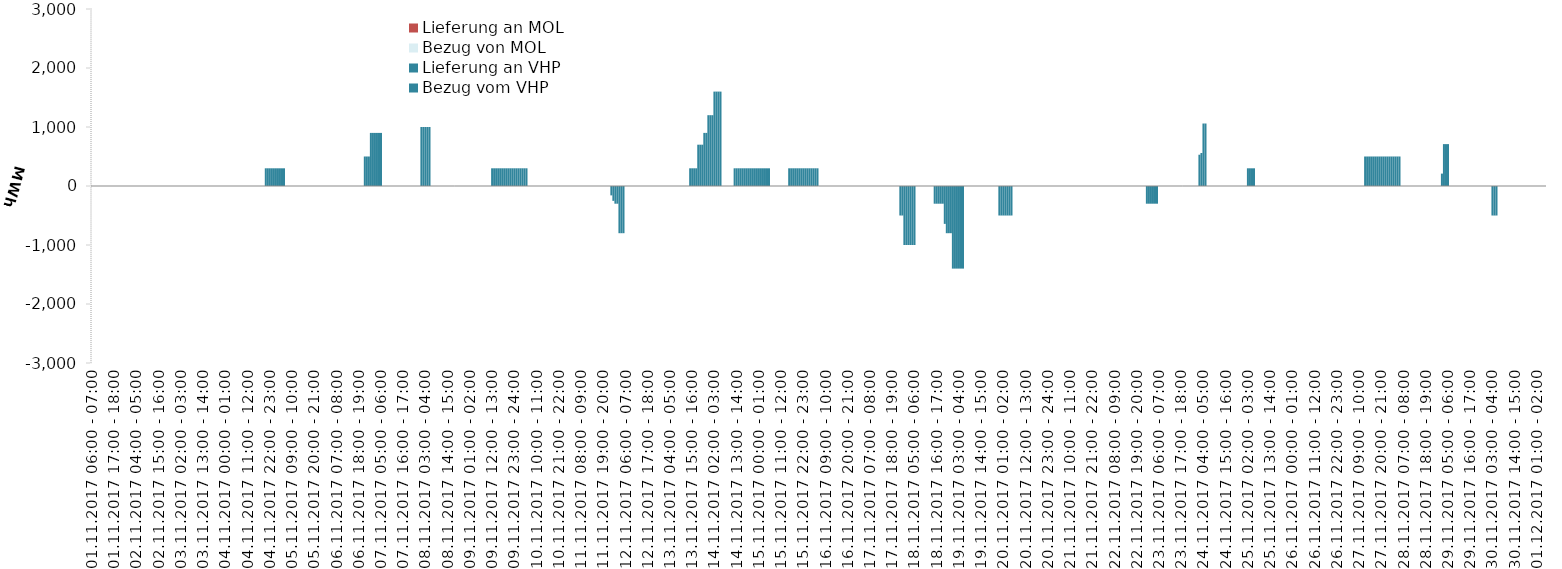
| Category | Bezug vom VHP | Lieferung an VHP | Bezug von MOL | Lieferung an MOL |
|---|---|---|---|---|
| 01.11.2017 06:00 - 07:00 | 0 | 0 | 0 | 0 |
| 01.11.2017 07:00 - 08:00 | 0 | 0 | 0 | 0 |
| 01.11.2017 08:00 - 09:00 | 0 | 0 | 0 | 0 |
| 01.11.2017 09:00 - 10:00 | 0 | 0 | 0 | 0 |
| 01.11.2017 10:00 - 11:00 | 0 | 0 | 0 | 0 |
| 01.11.2017 11:00 - 12:00 | 0 | 0 | 0 | 0 |
| 01.11.2017 12:00 - 13:00 | 0 | 0 | 0 | 0 |
| 01.11.2017 13:00 - 14:00 | 0 | 0 | 0 | 0 |
| 01.11.2017 14:00 - 15:00 | 0 | 0 | 0 | 0 |
| 01.11.2017 15:00 - 16:00 | 0 | 0 | 0 | 0 |
| 01.11.2017 16:00 - 17:00 | 0 | 0 | 0 | 0 |
| 01.11.2017 17:00 - 18:00 | 0 | 0 | 0 | 0 |
| 01.11.2017 18:00 - 19:00 | 0 | 0 | 0 | 0 |
| 01.11.2017 19:00 - 20:00 | 0 | 0 | 0 | 0 |
| 01.11.2017 20:00 - 21:00 | 0 | 0 | 0 | 0 |
| 01.11.2017 21:00 - 22:00 | 0 | 0 | 0 | 0 |
| 01.11.2017 22:00 - 23:00 | 0 | 0 | 0 | 0 |
| 01.11.2017 23:00 - 24:00 | 0 | 0 | 0 | 0 |
| 02.11.2017 00:00 - 01:00 | 0 | 0 | 0 | 0 |
| 02.11.2017 01:00 - 02:00 | 0 | 0 | 0 | 0 |
| 02.11.2017 02:00 - 03:00 | 0 | 0 | 0 | 0 |
| 02.11.2017 03:00 - 04:00 | 0 | 0 | 0 | 0 |
| 02.11.2017 04:00 - 05:00 | 0 | 0 | 0 | 0 |
| 02.11.2017 05:00 - 06:00 | 0 | 0 | 0 | 0 |
| 02.11.2017 06:00 - 07:00 | 0 | 0 | 0 | 0 |
| 02.11.2017 07:00 - 08:00 | 0 | 0 | 0 | 0 |
| 02.11.2017 08:00 - 09:00 | 0 | 0 | 0 | 0 |
| 02.11.2017 09:00 - 10:00 | 0 | 0 | 0 | 0 |
| 02.11.2017 10:00 - 11:00 | 0 | 0 | 0 | 0 |
| 02.11.2017 11:00 - 12:00 | 0 | 0 | 0 | 0 |
| 02.11.2017 12:00 - 13:00 | 0 | 0 | 0 | 0 |
| 02.11.2017 13:00 - 14:00 | 0 | 0 | 0 | 0 |
| 02.11.2017 14:00 - 15:00 | 0 | 0 | 0 | 0 |
| 02.11.2017 15:00 - 16:00 | 0 | 0 | 0 | 0 |
| 02.11.2017 16:00 - 17:00 | 0 | 0 | 0 | 0 |
| 02.11.2017 17:00 - 18:00 | 0 | 0 | 0 | 0 |
| 02.11.2017 18:00 - 19:00 | 0 | 0 | 0 | 0 |
| 02.11.2017 19:00 - 20:00 | 0 | 0 | 0 | 0 |
| 02.11.2017 20:00 - 21:00 | 0 | 0 | 0 | 0 |
| 02.11.2017 21:00 - 22:00 | 0 | 0 | 0 | 0 |
| 02.11.2017 22:00 - 23:00 | 0 | 0 | 0 | 0 |
| 02.11.2017 23:00 - 24:00 | 0 | 0 | 0 | 0 |
| 03.11.2017 00:00 - 01:00 | 0 | 0 | 0 | 0 |
| 03.11.2017 01:00 - 02:00 | 0 | 0 | 0 | 0 |
| 03.11.2017 02:00 - 03:00 | 0 | 0 | 0 | 0 |
| 03.11.2017 03:00 - 04:00 | 0 | 0 | 0 | 0 |
| 03.11.2017 04:00 - 05:00 | 0 | 0 | 0 | 0 |
| 03.11.2017 05:00 - 06:00 | 0 | 0 | 0 | 0 |
| 03.11.2017 06:00 - 07:00 | 0 | 0 | 0 | 0 |
| 03.11.2017 07:00 - 08:00 | 0 | 0 | 0 | 0 |
| 03.11.2017 08:00 - 09:00 | 0 | 0 | 0 | 0 |
| 03.11.2017 09:00 - 10:00 | 0 | 0 | 0 | 0 |
| 03.11.2017 10:00 - 11:00 | 0 | 0 | 0 | 0 |
| 03.11.2017 11:00 - 12:00 | 0 | 0 | 0 | 0 |
| 03.11.2017 12:00 - 13:00 | 0 | 0 | 0 | 0 |
| 03.11.2017 13:00 - 14:00 | 0 | 0 | 0 | 0 |
| 03.11.2017 14:00 - 15:00 | 0 | 0 | 0 | 0 |
| 03.11.2017 15:00 - 16:00 | 0 | 0 | 0 | 0 |
| 03.11.2017 16:00 - 17:00 | 0 | 0 | 0 | 0 |
| 03.11.2017 17:00 - 18:00 | 0 | 0 | 0 | 0 |
| 03.11.2017 18:00 - 19:00 | 0 | 0 | 0 | 0 |
| 03.11.2017 19:00 - 20:00 | 0 | 0 | 0 | 0 |
| 03.11.2017 20:00 - 21:00 | 0 | 0 | 0 | 0 |
| 03.11.2017 21:00 - 22:00 | 0 | 0 | 0 | 0 |
| 03.11.2017 22:00 - 23:00 | 0 | 0 | 0 | 0 |
| 03.11.2017 23:00 - 24:00 | 0 | 0 | 0 | 0 |
| 04.11.2017 00:00 - 01:00 | 0 | 0 | 0 | 0 |
| 04.11.2017 01:00 - 02:00 | 0 | 0 | 0 | 0 |
| 04.11.2017 02:00 - 03:00 | 0 | 0 | 0 | 0 |
| 04.11.2017 03:00 - 04:00 | 0 | 0 | 0 | 0 |
| 04.11.2017 04:00 - 05:00 | 0 | 0 | 0 | 0 |
| 04.11.2017 05:00 - 06:00 | 0 | 0 | 0 | 0 |
| 04.11.2017 06:00 - 07:00 | 0 | 0 | 0 | 0 |
| 04.11.2017 07:00 - 08:00 | 0 | 0 | 0 | 0 |
| 04.11.2017 08:00 - 09:00 | 0 | 0 | 0 | 0 |
| 04.11.2017 09:00 - 10:00 | 0 | 0 | 0 | 0 |
| 04.11.2017 10:00 - 11:00 | 0 | 0 | 0 | 0 |
| 04.11.2017 11:00 - 12:00 | 0 | 0 | 0 | 0 |
| 04.11.2017 12:00 - 13:00 | 0 | 0 | 0 | 0 |
| 04.11.2017 13:00 - 14:00 | 0 | 0 | 0 | 0 |
| 04.11.2017 14:00 - 15:00 | 0 | 0 | 0 | 0 |
| 04.11.2017 15:00 - 16:00 | 0 | 0 | 0 | 0 |
| 04.11.2017 16:00 - 17:00 | 0 | 0 | 0 | 0 |
| 04.11.2017 17:00 - 18:00 | 0 | 0 | 0 | 0 |
| 04.11.2017 18:00 - 19:00 | 0 | 0 | 0 | 0 |
| 04.11.2017 19:00 - 20:00 | 0 | 0 | 0 | 0 |
| 04.11.2017 20:00 - 21:00 | 300 | 0 | 0 | 0 |
| 04.11.2017 21:00 - 22:00 | 300 | 0 | 0 | 0 |
| 04.11.2017 22:00 - 23:00 | 300 | 0 | 0 | 0 |
| 04.11.2017 23:00 - 24:00 | 300 | 0 | 0 | 0 |
| 05.11.2017 00:00 - 01:00 | 300 | 0 | 0 | 0 |
| 05.11.2017 01:00 - 02:00 | 300 | 0 | 0 | 0 |
| 05.11.2017 02:00 - 03:00 | 300 | 0 | 0 | 0 |
| 05.11.2017 03:00 - 04:00 | 300 | 0 | 0 | 0 |
| 05.11.2017 04:00 - 05:00 | 300 | 0 | 0 | 0 |
| 05.11.2017 05:00 - 06:00 | 300 | 0 | 0 | 0 |
| 05.11.2017 06:00 - 07:00 | 0 | 0 | 0 | 0 |
| 05.11.2017 07:00 - 08:00 | 0 | 0 | 0 | 0 |
| 05.11.2017 08:00 - 09:00 | 0 | 0 | 0 | 0 |
| 05.11.2017 09:00 - 10:00 | 0 | 0 | 0 | 0 |
| 05.11.2017 10:00 - 11:00 | 0 | 0 | 0 | 0 |
| 05.11.2017 11:00 - 12:00 | 0 | 0 | 0 | 0 |
| 05.11.2017 12:00 - 13:00 | 0 | 0 | 0 | 0 |
| 05.11.2017 13:00 - 14:00 | 0 | 0 | 0 | 0 |
| 05.11.2017 14:00 - 15:00 | 0 | 0 | 0 | 0 |
| 05.11.2017 15:00 - 16:00 | 0 | 0 | 0 | 0 |
| 05.11.2017 16:00 - 17:00 | 0 | 0 | 0 | 0 |
| 05.11.2017 17:00 - 18:00 | 0 | 0 | 0 | 0 |
| 05.11.2017 18:00 - 19:00 | 0 | 0 | 0 | 0 |
| 05.11.2017 19:00 - 20:00 | 0 | 0 | 0 | 0 |
| 05.11.2017 20:00 - 21:00 | 0 | 0 | 0 | 0 |
| 05.11.2017 21:00 - 22:00 | 0 | 0 | 0 | 0 |
| 05.11.2017 22:00 - 23:00 | 0 | 0 | 0 | 0 |
| 05.11.2017 23:00 - 24:00 | 0 | 0 | 0 | 0 |
| 06.11.2017 00:00 - 01:00 | 0 | 0 | 0 | 0 |
| 06.11.2017 01:00 - 02:00 | 0 | 0 | 0 | 0 |
| 06.11.2017 02:00 - 03:00 | 0 | 0 | 0 | 0 |
| 06.11.2017 03:00 - 04:00 | 0 | 0 | 0 | 0 |
| 06.11.2017 04:00 - 05:00 | 0 | 0 | 0 | 0 |
| 06.11.2017 05:00 - 06:00 | 0 | 0 | 0 | 0 |
| 06.11.2017 06:00 - 07:00 | 0 | 0 | 0 | 0 |
| 06.11.2017 07:00 - 08:00 | 0 | 0 | 0 | 0 |
| 06.11.2017 08:00 - 09:00 | 0 | 0 | 0 | 0 |
| 06.11.2017 09:00 - 10:00 | 0 | 0 | 0 | 0 |
| 06.11.2017 10:00 - 11:00 | 0 | 0 | 0 | 0 |
| 06.11.2017 11:00 - 12:00 | 0 | 0 | 0 | 0 |
| 06.11.2017 12:00 - 13:00 | 0 | 0 | 0 | 0 |
| 06.11.2017 13:00 - 14:00 | 0 | 0 | 0 | 0 |
| 06.11.2017 14:00 - 15:00 | 0 | 0 | 0 | 0 |
| 06.11.2017 15:00 - 16:00 | 0 | 0 | 0 | 0 |
| 06.11.2017 16:00 - 17:00 | 0 | 0 | 0 | 0 |
| 06.11.2017 17:00 - 18:00 | 0 | 0 | 0 | 0 |
| 06.11.2017 18:00 - 19:00 | 0 | 0 | 0 | 0 |
| 06.11.2017 19:00 - 20:00 | 0 | 0 | 0 | 0 |
| 06.11.2017 20:00 - 21:00 | 0 | 0 | 0 | 0 |
| 06.11.2017 21:00 - 22:00 | 500 | 0 | 0 | 0 |
| 06.11.2017 22:00 - 23:00 | 500 | 0 | 0 | 0 |
| 06.11.2017 23:00 - 24:00 | 500 | 0 | 0 | 0 |
| 07.11.2017 00:00 - 01:00 | 900 | 0 | 0 | 0 |
| 07.11.2017 01:00 - 02:00 | 900 | 0 | 0 | 0 |
| 07.11.2017 02:00 - 03:00 | 900 | 0 | 0 | 0 |
| 07.11.2017 03:00 - 04:00 | 900 | 0 | 0 | 0 |
| 07.11.2017 04:00 - 05:00 | 900 | 0 | 0 | 0 |
| 07.11.2017 05:00 - 06:00 | 900 | 0 | 0 | 0 |
| 07.11.2017 06:00 - 07:00 | 0 | 0 | 0 | 0 |
| 07.11.2017 07:00 - 08:00 | 0 | 0 | 0 | 0 |
| 07.11.2017 08:00 - 09:00 | 0 | 0 | 0 | 0 |
| 07.11.2017 09:00 - 10:00 | 0 | 0 | 0 | 0 |
| 07.11.2017 10:00 - 11:00 | 0 | 0 | 0 | 0 |
| 07.11.2017 11:00 - 12:00 | 0 | 0 | 0 | 0 |
| 07.11.2017 12:00 - 13:00 | 0 | 0 | 0 | 0 |
| 07.11.2017 13:00 - 14:00 | 0 | 0 | 0 | 0 |
| 07.11.2017 14:00 - 15:00 | 0 | 0 | 0 | 0 |
| 07.11.2017 15:00 - 16:00 | 0 | 0 | 0 | 0 |
| 07.11.2017 16:00 - 17:00 | 0 | 0 | 0 | 0 |
| 07.11.2017 17:00 - 18:00 | 0 | 0 | 0 | 0 |
| 07.11.2017 18:00 - 19:00 | 0 | 0 | 0 | 0 |
| 07.11.2017 19:00 - 20:00 | 0 | 0 | 0 | 0 |
| 07.11.2017 20:00 - 21:00 | 0 | 0 | 0 | 0 |
| 07.11.2017 21:00 - 22:00 | 0 | 0 | 0 | 0 |
| 07.11.2017 22:00 - 23:00 | 0 | 0 | 0 | 0 |
| 07.11.2017 23:00 - 24:00 | 0 | 0 | 0 | 0 |
| 08.11.2017 00:00 - 01:00 | 0 | 0 | 0 | 0 |
| 08.11.2017 01:00 - 02:00 | 1000 | 0 | 0 | 0 |
| 08.11.2017 02:00 - 03:00 | 1000 | 0 | 0 | 0 |
| 08.11.2017 03:00 - 04:00 | 1000 | 0 | 0 | 0 |
| 08.11.2017 04:00 - 05:00 | 1000 | 0 | 0 | 0 |
| 08.11.2017 05:00 - 06:00 | 1000 | 0 | 0 | 0 |
| 08.11.2017 06:00 - 07:00 | 0 | 0 | 0 | 0 |
| 08.11.2017 07:00 - 08:00 | 0 | 0 | 0 | 0 |
| 08.11.2017 08:00 - 09:00 | 0 | 0 | 0 | 0 |
| 08.11.2017 09:00 - 10:00 | 0 | 0 | 0 | 0 |
| 08.11.2017 10:00 - 11:00 | 0 | 0 | 0 | 0 |
| 08.11.2017 11:00 - 12:00 | 0 | 0 | 0 | 0 |
| 08.11.2017 12:00 - 13:00 | 0 | 0 | 0 | 0 |
| 08.11.2017 13:00 - 14:00 | 0 | 0 | 0 | 0 |
| 08.11.2017 14:00 - 15:00 | 0 | 0 | 0 | 0 |
| 08.11.2017 15:00 - 16:00 | 0 | 0 | 0 | 0 |
| 08.11.2017 16:00 - 17:00 | 0 | 0 | 0 | 0 |
| 08.11.2017 17:00 - 18:00 | 0 | 0 | 0 | 0 |
| 08.11.2017 18:00 - 19:00 | 0 | 0 | 0 | 0 |
| 08.11.2017 19:00 - 20:00 | 0 | 0 | 0 | 0 |
| 08.11.2017 20:00 - 21:00 | 0 | 0 | 0 | 0 |
| 08.11.2017 21:00 - 22:00 | 0 | 0 | 0 | 0 |
| 08.11.2017 22:00 - 23:00 | 0 | 0 | 0 | 0 |
| 08.11.2017 23:00 - 24:00 | 0 | 0 | 0 | 0 |
| 09.11.2017 00:00 - 01:00 | 0 | 0 | 0 | 0 |
| 09.11.2017 01:00 - 02:00 | 0 | 0 | 0 | 0 |
| 09.11.2017 02:00 - 03:00 | 0 | 0 | 0 | 0 |
| 09.11.2017 03:00 - 04:00 | 0 | 0 | 0 | 0 |
| 09.11.2017 04:00 - 05:00 | 0 | 0 | 0 | 0 |
| 09.11.2017 05:00 - 06:00 | 0 | 0 | 0 | 0 |
| 09.11.2017 06:00 - 07:00 | 0 | 0 | 0 | 0 |
| 09.11.2017 07:00 - 08:00 | 0 | 0 | 0 | 0 |
| 09.11.2017 08:00 - 09:00 | 0 | 0 | 0 | 0 |
| 09.11.2017 09:00 - 10:00 | 0 | 0 | 0 | 0 |
| 09.11.2017 10:00 - 11:00 | 0 | 0 | 0 | 0 |
| 09.11.2017 11:00 - 12:00 | 0 | 0 | 0 | 0 |
| 09.11.2017 12:00 - 13:00 | 300 | 0 | 0 | 0 |
| 09.11.2017 13:00 - 14:00 | 300 | 0 | 0 | 0 |
| 09.11.2017 14:00 - 15:00 | 300 | 0 | 0 | 0 |
| 09.11.2017 15:00 - 16:00 | 300 | 0 | 0 | 0 |
| 09.11.2017 16:00 - 17:00 | 300 | 0 | 0 | 0 |
| 09.11.2017 17:00 - 18:00 | 300 | 0 | 0 | 0 |
| 09.11.2017 18:00 - 19:00 | 300 | 0 | 0 | 0 |
| 09.11.2017 19:00 - 20:00 | 300 | 0 | 0 | 0 |
| 09.11.2017 20:00 - 21:00 | 300 | 0 | 0 | 0 |
| 09.11.2017 21:00 - 22:00 | 300 | 0 | 0 | 0 |
| 09.11.2017 22:00 - 23:00 | 300 | 0 | 0 | 0 |
| 09.11.2017 23:00 - 24:00 | 300 | 0 | 0 | 0 |
| 10.11.2017 00:00 - 01:00 | 300 | 0 | 0 | 0 |
| 10.11.2017 01:00 - 02:00 | 300 | 0 | 0 | 0 |
| 10.11.2017 02:00 - 03:00 | 300 | 0 | 0 | 0 |
| 10.11.2017 03:00 - 04:00 | 300 | 0 | 0 | 0 |
| 10.11.2017 04:00 - 05:00 | 300 | 0 | 0 | 0 |
| 10.11.2017 05:00 - 06:00 | 300 | 0 | 0 | 0 |
| 10.11.2017 06:00 - 07:00 | 0 | 0 | 0 | 0 |
| 10.11.2017 07:00 - 08:00 | 0 | 0 | 0 | 0 |
| 10.11.2017 08:00 - 09:00 | 0 | 0 | 0 | 0 |
| 10.11.2017 09:00 - 10:00 | 0 | 0 | 0 | 0 |
| 10.11.2017 10:00 - 11:00 | 0 | 0 | 0 | 0 |
| 10.11.2017 11:00 - 12:00 | 0 | 0 | 0 | 0 |
| 10.11.2017 12:00 - 13:00 | 0 | 0 | 0 | 0 |
| 10.11.2017 13:00 - 14:00 | 0 | 0 | 0 | 0 |
| 10.11.2017 14:00 - 15:00 | 0 | 0 | 0 | 0 |
| 10.11.2017 15:00 - 16:00 | 0 | 0 | 0 | 0 |
| 10.11.2017 16:00 - 17:00 | 0 | 0 | 0 | 0 |
| 10.11.2017 17:00 - 18:00 | 0 | 0 | 0 | 0 |
| 10.11.2017 18:00 - 19:00 | 0 | 0 | 0 | 0 |
| 10.11.2017 19:00 - 20:00 | 0 | 0 | 0 | 0 |
| 10.11.2017 20:00 - 21:00 | 0 | 0 | 0 | 0 |
| 10.11.2017 21:00 - 22:00 | 0 | 0 | 0 | 0 |
| 10.11.2017 22:00 - 23:00 | 0 | 0 | 0 | 0 |
| 10.11.2017 23:00 - 24:00 | 0 | 0 | 0 | 0 |
| 11.11.2017 00:00 - 01:00 | 0 | 0 | 0 | 0 |
| 11.11.2017 01:00 - 02:00 | 0 | 0 | 0 | 0 |
| 11.11.2017 02:00 - 03:00 | 0 | 0 | 0 | 0 |
| 11.11.2017 03:00 - 04:00 | 0 | 0 | 0 | 0 |
| 11.11.2017 04:00 - 05:00 | 0 | 0 | 0 | 0 |
| 11.11.2017 05:00 - 06:00 | 0 | 0 | 0 | 0 |
| 11.11.2017 06:00 - 07:00 | 0 | 0 | 0 | 0 |
| 11.11.2017 07:00 - 08:00 | 0 | 0 | 0 | 0 |
| 11.11.2017 08:00 - 09:00 | 0 | 0 | 0 | 0 |
| 11.11.2017 09:00 - 10:00 | 0 | 0 | 0 | 0 |
| 11.11.2017 10:00 - 11:00 | 0 | 0 | 0 | 0 |
| 11.11.2017 11:00 - 12:00 | 0 | 0 | 0 | 0 |
| 11.11.2017 12:00 - 13:00 | 0 | 0 | 0 | 0 |
| 11.11.2017 13:00 - 14:00 | 0 | 0 | 0 | 0 |
| 11.11.2017 14:00 - 15:00 | 0 | 0 | 0 | 0 |
| 11.11.2017 15:00 - 16:00 | 0 | 0 | 0 | 0 |
| 11.11.2017 16:00 - 17:00 | 0 | 0 | 0 | 0 |
| 11.11.2017 17:00 - 18:00 | 0 | 0 | 0 | 0 |
| 11.11.2017 18:00 - 19:00 | 0 | 0 | 0 | 0 |
| 11.11.2017 19:00 - 20:00 | 0 | 0 | 0 | 0 |
| 11.11.2017 20:00 - 21:00 | 0 | 0 | 0 | 0 |
| 11.11.2017 21:00 - 22:00 | 0 | 0 | 0 | 0 |
| 11.11.2017 22:00 - 23:00 | 0 | 0 | 0 | 0 |
| 11.11.2017 23:00 - 24:00 | 0 | -159 | 0 | 0 |
| 12.11.2017 00:00 - 01:00 | 0 | -252 | 0 | 0 |
| 12.11.2017 01:00 - 02:00 | 0 | -300 | 0 | 0 |
| 12.11.2017 02:00 - 03:00 | 0 | -300 | 0 | 0 |
| 12.11.2017 03:00 - 04:00 | 0 | -800 | 0 | 0 |
| 12.11.2017 04:00 - 05:00 | 0 | -800 | 0 | 0 |
| 12.11.2017 05:00 - 06:00 | 0 | -800 | 0 | 0 |
| 12.11.2017 06:00 - 07:00 | 0 | 0 | 0 | 0 |
| 12.11.2017 07:00 - 08:00 | 0 | 0 | 0 | 0 |
| 12.11.2017 08:00 - 09:00 | 0 | 0 | 0 | 0 |
| 12.11.2017 09:00 - 10:00 | 0 | 0 | 0 | 0 |
| 12.11.2017 10:00 - 11:00 | 0 | 0 | 0 | 0 |
| 12.11.2017 11:00 - 12:00 | 0 | 0 | 0 | 0 |
| 12.11.2017 12:00 - 13:00 | 0 | 0 | 0 | 0 |
| 12.11.2017 13:00 - 14:00 | 0 | 0 | 0 | 0 |
| 12.11.2017 14:00 - 15:00 | 0 | 0 | 0 | 0 |
| 12.11.2017 15:00 - 16:00 | 0 | 0 | 0 | 0 |
| 12.11.2017 16:00 - 17:00 | 0 | 0 | 0 | 0 |
| 12.11.2017 17:00 - 18:00 | 0 | 0 | 0 | 0 |
| 12.11.2017 18:00 - 19:00 | 0 | 0 | 0 | 0 |
| 12.11.2017 19:00 - 20:00 | 0 | 0 | 0 | 0 |
| 12.11.2017 20:00 - 21:00 | 0 | 0 | 0 | 0 |
| 12.11.2017 21:00 - 22:00 | 0 | 0 | 0 | 0 |
| 12.11.2017 22:00 - 23:00 | 0 | 0 | 0 | 0 |
| 12.11.2017 23:00 - 24:00 | 0 | 0 | 0 | 0 |
| 13.11.2017 00:00 - 01:00 | 0 | 0 | 0 | 0 |
| 13.11.2017 01:00 - 02:00 | 0 | 0 | 0 | 0 |
| 13.11.2017 02:00 - 03:00 | 0 | 0 | 0 | 0 |
| 13.11.2017 03:00 - 04:00 | 0 | 0 | 0 | 0 |
| 13.11.2017 04:00 - 05:00 | 0 | 0 | 0 | 0 |
| 13.11.2017 05:00 - 06:00 | 0 | 0 | 0 | 0 |
| 13.11.2017 06:00 - 07:00 | 0 | 0 | 0 | 0 |
| 13.11.2017 07:00 - 08:00 | 0 | 0 | 0 | 0 |
| 13.11.2017 08:00 - 09:00 | 0 | 0 | 0 | 0 |
| 13.11.2017 09:00 - 10:00 | 0 | 0 | 0 | 0 |
| 13.11.2017 10:00 - 11:00 | 0 | 0 | 0 | 0 |
| 13.11.2017 11:00 - 12:00 | 0 | 0 | 0 | 0 |
| 13.11.2017 12:00 - 13:00 | 0 | 0 | 0 | 0 |
| 13.11.2017 13:00 - 14:00 | 0 | 0 | 0 | 0 |
| 13.11.2017 14:00 - 15:00 | 300 | 0 | 0 | 0 |
| 13.11.2017 15:00 - 16:00 | 300 | 0 | 0 | 0 |
| 13.11.2017 16:00 - 17:00 | 300 | 0 | 0 | 0 |
| 13.11.2017 17:00 - 18:00 | 300 | 0 | 0 | 0 |
| 13.11.2017 18:00 - 19:00 | 700 | 0 | 0 | 0 |
| 13.11.2017 19:00 - 20:00 | 700 | 0 | 0 | 0 |
| 13.11.2017 20:00 - 21:00 | 700 | 0 | 0 | 0 |
| 13.11.2017 21:00 - 22:00 | 900 | 0 | 0 | 0 |
| 13.11.2017 22:00 - 23:00 | 900 | 0 | 0 | 0 |
| 13.11.2017 23:00 - 24:00 | 1200 | 0 | 0 | 0 |
| 14.11.2017 00:00 - 01:00 | 1200 | 0 | 0 | 0 |
| 14.11.2017 01:00 - 02:00 | 1200 | 0 | 0 | 0 |
| 14.11.2017 02:00 - 03:00 | 1600 | 0 | 0 | 0 |
| 14.11.2017 03:00 - 04:00 | 1600 | 0 | 0 | 0 |
| 14.11.2017 04:00 - 05:00 | 1600 | 0 | 0 | 0 |
| 14.11.2017 05:00 - 06:00 | 1600 | 0 | 0 | 0 |
| 14.11.2017 06:00 - 07:00 | 0 | 0 | 0 | 0 |
| 14.11.2017 07:00 - 08:00 | 0 | 0 | 0 | 0 |
| 14.11.2017 08:00 - 09:00 | 0 | 0 | 0 | 0 |
| 14.11.2017 09:00 - 10:00 | 0 | 0 | 0 | 0 |
| 14.11.2017 10:00 - 11:00 | 0 | 0 | 0 | 0 |
| 14.11.2017 11:00 - 12:00 | 0 | 0 | 0 | 0 |
| 14.11.2017 12:00 - 13:00 | 300 | 0 | 0 | 0 |
| 14.11.2017 13:00 - 14:00 | 300 | 0 | 0 | 0 |
| 14.11.2017 14:00 - 15:00 | 300 | 0 | 0 | 0 |
| 14.11.2017 15:00 - 16:00 | 300 | 0 | 0 | 0 |
| 14.11.2017 16:00 - 17:00 | 300 | 0 | 0 | 0 |
| 14.11.2017 17:00 - 18:00 | 300 | 0 | 0 | 0 |
| 14.11.2017 18:00 - 19:00 | 300 | 0 | 0 | 0 |
| 14.11.2017 19:00 - 20:00 | 300 | 0 | 0 | 0 |
| 14.11.2017 20:00 - 21:00 | 300 | 0 | 0 | 0 |
| 14.11.2017 21:00 - 22:00 | 300 | 0 | 0 | 0 |
| 14.11.2017 22:00 - 23:00 | 300 | 0 | 0 | 0 |
| 14.11.2017 23:00 - 24:00 | 300 | 0 | 0 | 0 |
| 15.11.2017 00:00 - 01:00 | 300 | 0 | 0 | 0 |
| 15.11.2017 01:00 - 02:00 | 300 | 0 | 0 | 0 |
| 15.11.2017 02:00 - 03:00 | 300 | 0 | 0 | 0 |
| 15.11.2017 03:00 - 04:00 | 300 | 0 | 0 | 0 |
| 15.11.2017 04:00 - 05:00 | 300 | 0 | 0 | 0 |
| 15.11.2017 05:00 - 06:00 | 300 | 0 | 0 | 0 |
| 15.11.2017 06:00 - 07:00 | 0 | 0 | 0 | 0 |
| 15.11.2017 07:00 - 08:00 | 0 | 0 | 0 | 0 |
| 15.11.2017 08:00 - 09:00 | 0 | 0 | 0 | 0 |
| 15.11.2017 09:00 - 10:00 | 0 | 0 | 0 | 0 |
| 15.11.2017 10:00 - 11:00 | 0 | 0 | 0 | 0 |
| 15.11.2017 11:00 - 12:00 | 0 | 0 | 0 | 0 |
| 15.11.2017 12:00 - 13:00 | 0 | 0 | 0 | 0 |
| 15.11.2017 13:00 - 14:00 | 0 | 0 | 0 | 0 |
| 15.11.2017 14:00 - 15:00 | 0 | 0 | 0 | 0 |
| 15.11.2017 15:00 - 16:00 | 300 | 0 | 0 | 0 |
| 15.11.2017 16:00 - 17:00 | 300 | 0 | 0 | 0 |
| 15.11.2017 17:00 - 18:00 | 300 | 0 | 0 | 0 |
| 15.11.2017 18:00 - 19:00 | 300 | 0 | 0 | 0 |
| 15.11.2017 19:00 - 20:00 | 300 | 0 | 0 | 0 |
| 15.11.2017 20:00 - 21:00 | 300 | 0 | 0 | 0 |
| 15.11.2017 21:00 - 22:00 | 300 | 0 | 0 | 0 |
| 15.11.2017 22:00 - 23:00 | 300 | 0 | 0 | 0 |
| 15.11.2017 23:00 - 24:00 | 300 | 0 | 0 | 0 |
| 16.11.2017 00:00 - 01:00 | 300 | 0 | 0 | 0 |
| 16.11.2017 01:00 - 02:00 | 300 | 0 | 0 | 0 |
| 16.11.2017 02:00 - 03:00 | 300 | 0 | 0 | 0 |
| 16.11.2017 03:00 - 04:00 | 300 | 0 | 0 | 0 |
| 16.11.2017 04:00 - 05:00 | 300 | 0 | 0 | 0 |
| 16.11.2017 05:00 - 06:00 | 300 | 0 | 0 | 0 |
| 16.11.2017 06:00 - 07:00 | 0 | 0 | 0 | 0 |
| 16.11.2017 07:00 - 08:00 | 0 | 0 | 0 | 0 |
| 16.11.2017 08:00 - 09:00 | 0 | 0 | 0 | 0 |
| 16.11.2017 09:00 - 10:00 | 0 | 0 | 0 | 0 |
| 16.11.2017 10:00 - 11:00 | 0 | 0 | 0 | 0 |
| 16.11.2017 11:00 - 12:00 | 0 | 0 | 0 | 0 |
| 16.11.2017 12:00 - 13:00 | 0 | 0 | 0 | 0 |
| 16.11.2017 13:00 - 14:00 | 0 | 0 | 0 | 0 |
| 16.11.2017 14:00 - 15:00 | 0 | 0 | 0 | 0 |
| 16.11.2017 15:00 - 16:00 | 0 | 0 | 0 | 0 |
| 16.11.2017 16:00 - 17:00 | 0 | 0 | 0 | 0 |
| 16.11.2017 17:00 - 18:00 | 0 | 0 | 0 | 0 |
| 16.11.2017 18:00 - 19:00 | 0 | 0 | 0 | 0 |
| 16.11.2017 19:00 - 20:00 | 0 | 0 | 0 | 0 |
| 16.11.2017 20:00 - 21:00 | 0 | 0 | 0 | 0 |
| 16.11.2017 21:00 - 22:00 | 0 | 0 | 0 | 0 |
| 16.11.2017 22:00 - 23:00 | 0 | 0 | 0 | 0 |
| 16.11.2017 23:00 - 24:00 | 0 | 0 | 0 | 0 |
| 17.11.2017 00:00 - 01:00 | 0 | 0 | 0 | 0 |
| 17.11.2017 01:00 - 02:00 | 0 | 0 | 0 | 0 |
| 17.11.2017 02:00 - 03:00 | 0 | 0 | 0 | 0 |
| 17.11.2017 03:00 - 04:00 | 0 | 0 | 0 | 0 |
| 17.11.2017 04:00 - 05:00 | 0 | 0 | 0 | 0 |
| 17.11.2017 05:00 - 06:00 | 0 | 0 | 0 | 0 |
| 17.11.2017 06:00 - 07:00 | 0 | 0 | 0 | 0 |
| 17.11.2017 07:00 - 08:00 | 0 | 0 | 0 | 0 |
| 17.11.2017 08:00 - 09:00 | 0 | 0 | 0 | 0 |
| 17.11.2017 09:00 - 10:00 | 0 | 0 | 0 | 0 |
| 17.11.2017 10:00 - 11:00 | 0 | 0 | 0 | 0 |
| 17.11.2017 11:00 - 12:00 | 0 | 0 | 0 | 0 |
| 17.11.2017 12:00 - 13:00 | 0 | 0 | 0 | 0 |
| 17.11.2017 13:00 - 14:00 | 0 | 0 | 0 | 0 |
| 17.11.2017 14:00 - 15:00 | 0 | 0 | 0 | 0 |
| 17.11.2017 15:00 - 16:00 | 0 | 0 | 0 | 0 |
| 17.11.2017 16:00 - 17:00 | 0 | 0 | 0 | 0 |
| 17.11.2017 17:00 - 18:00 | 0 | 0 | 0 | 0 |
| 17.11.2017 18:00 - 19:00 | 0 | 0 | 0 | 0 |
| 17.11.2017 19:00 - 20:00 | 0 | 0 | 0 | 0 |
| 17.11.2017 20:00 - 21:00 | 0 | 0 | 0 | 0 |
| 17.11.2017 21:00 - 22:00 | 0 | 0 | 0 | 0 |
| 17.11.2017 22:00 - 23:00 | 0 | -500 | 0 | 0 |
| 17.11.2017 23:00 - 24:00 | 0 | -500 | 0 | 0 |
| 18.11.2017 00:00 - 01:00 | 0 | -1000 | 0 | 0 |
| 18.11.2017 01:00 - 02:00 | 0 | -1000 | 0 | 0 |
| 18.11.2017 02:00 - 03:00 | 0 | -1000 | 0 | 0 |
| 18.11.2017 03:00 - 04:00 | 0 | -1000 | 0 | 0 |
| 18.11.2017 04:00 - 05:00 | 0 | -1000 | 0 | 0 |
| 18.11.2017 05:00 - 06:00 | 0 | -1000 | 0 | 0 |
| 18.11.2017 06:00 - 07:00 | 0 | 0 | 0 | 0 |
| 18.11.2017 07:00 - 08:00 | 0 | 0 | 0 | 0 |
| 18.11.2017 08:00 - 09:00 | 0 | 0 | 0 | 0 |
| 18.11.2017 09:00 - 10:00 | 0 | 0 | 0 | 0 |
| 18.11.2017 10:00 - 11:00 | 0 | 0 | 0 | 0 |
| 18.11.2017 11:00 - 12:00 | 0 | 0 | 0 | 0 |
| 18.11.2017 12:00 - 13:00 | 0 | 0 | 0 | 0 |
| 18.11.2017 13:00 - 14:00 | 0 | 0 | 0 | 0 |
| 18.11.2017 14:00 - 15:00 | 0 | 0 | 0 | 0 |
| 18.11.2017 15:00 - 16:00 | 0 | -300 | 0 | 0 |
| 18.11.2017 16:00 - 17:00 | 0 | -300 | 0 | 0 |
| 18.11.2017 17:00 - 18:00 | 0 | -300 | 0 | 0 |
| 18.11.2017 18:00 - 19:00 | 0 | -300 | 0 | 0 |
| 18.11.2017 19:00 - 20:00 | 0 | -300 | 0 | 0 |
| 18.11.2017 20:00 - 21:00 | 0 | -642 | 0 | 0 |
| 18.11.2017 21:00 - 22:00 | 0 | -800 | 0 | 0 |
| 18.11.2017 22:00 - 23:00 | 0 | -800 | 0 | 0 |
| 18.11.2017 23:00 - 24:00 | 0 | -800 | 0 | 0 |
| 19.11.2017 00:00 - 01:00 | 0 | -1400 | 0 | 0 |
| 19.11.2017 01:00 - 02:00 | 0 | -1400 | 0 | 0 |
| 19.11.2017 02:00 - 03:00 | 0 | -1400 | 0 | 0 |
| 19.11.2017 03:00 - 04:00 | 0 | -1400 | 0 | 0 |
| 19.11.2017 04:00 - 05:00 | 0 | -1400 | 0 | 0 |
| 19.11.2017 05:00 - 06:00 | 0 | -1400 | 0 | 0 |
| 19.11.2017 06:00 - 07:00 | 0 | 0 | 0 | 0 |
| 19.11.2017 07:00 - 08:00 | 0 | 0 | 0 | 0 |
| 19.11.2017 08:00 - 09:00 | 0 | 0 | 0 | 0 |
| 19.11.2017 09:00 - 10:00 | 0 | 0 | 0 | 0 |
| 19.11.2017 10:00 - 11:00 | 0 | 0 | 0 | 0 |
| 19.11.2017 11:00 - 12:00 | 0 | 0 | 0 | 0 |
| 19.11.2017 12:00 - 13:00 | 0 | 0 | 0 | 0 |
| 19.11.2017 13:00 - 14:00 | 0 | 0 | 0 | 0 |
| 19.11.2017 14:00 - 15:00 | 0 | 0 | 0 | 0 |
| 19.11.2017 15:00 - 16:00 | 0 | 0 | 0 | 0 |
| 19.11.2017 16:00 - 17:00 | 0 | 0 | 0 | 0 |
| 19.11.2017 17:00 - 18:00 | 0 | 0 | 0 | 0 |
| 19.11.2017 18:00 - 19:00 | 0 | 0 | 0 | 0 |
| 19.11.2017 19:00 - 20:00 | 0 | 0 | 0 | 0 |
| 19.11.2017 20:00 - 21:00 | 0 | 0 | 0 | 0 |
| 19.11.2017 21:00 - 22:00 | 0 | 0 | 0 | 0 |
| 19.11.2017 22:00 - 23:00 | 0 | 0 | 0 | 0 |
| 19.11.2017 23:00 - 24:00 | 0 | -500 | 0 | 0 |
| 20.11.2017 00:00 - 01:00 | 0 | -500 | 0 | 0 |
| 20.11.2017 01:00 - 02:00 | 0 | -500 | 0 | 0 |
| 20.11.2017 02:00 - 03:00 | 0 | -500 | 0 | 0 |
| 20.11.2017 03:00 - 04:00 | 0 | -500 | 0 | 0 |
| 20.11.2017 04:00 - 05:00 | 0 | -500 | 0 | 0 |
| 20.11.2017 05:00 - 06:00 | 0 | -500 | 0 | 0 |
| 20.11.2017 06:00 - 07:00 | 0 | 0 | 0 | 0 |
| 20.11.2017 07:00 - 08:00 | 0 | 0 | 0 | 0 |
| 20.11.2017 08:00 - 09:00 | 0 | 0 | 0 | 0 |
| 20.11.2017 09:00 - 10:00 | 0 | 0 | 0 | 0 |
| 20.11.2017 10:00 - 11:00 | 0 | 0 | 0 | 0 |
| 20.11.2017 11:00 - 12:00 | 0 | 0 | 0 | 0 |
| 20.11.2017 12:00 - 13:00 | 0 | 0 | 0 | 0 |
| 20.11.2017 13:00 - 14:00 | 0 | 0 | 0 | 0 |
| 20.11.2017 14:00 - 15:00 | 0 | 0 | 0 | 0 |
| 20.11.2017 15:00 - 16:00 | 0 | 0 | 0 | 0 |
| 20.11.2017 16:00 - 17:00 | 0 | 0 | 0 | 0 |
| 20.11.2017 17:00 - 18:00 | 0 | 0 | 0 | 0 |
| 20.11.2017 18:00 - 19:00 | 0 | 0 | 0 | 0 |
| 20.11.2017 19:00 - 20:00 | 0 | 0 | 0 | 0 |
| 20.11.2017 20:00 - 21:00 | 0 | 0 | 0 | 0 |
| 20.11.2017 21:00 - 22:00 | 0 | 0 | 0 | 0 |
| 20.11.2017 22:00 - 23:00 | 0 | 0 | 0 | 0 |
| 20.11.2017 23:00 - 24:00 | 0 | 0 | 0 | 0 |
| 21.11.2017 00:00 - 01:00 | 0 | 0 | 0 | 0 |
| 21.11.2017 01:00 - 02:00 | 0 | 0 | 0 | 0 |
| 21.11.2017 02:00 - 03:00 | 0 | 0 | 0 | 0 |
| 21.11.2017 03:00 - 04:00 | 0 | 0 | 0 | 0 |
| 21.11.2017 04:00 - 05:00 | 0 | 0 | 0 | 0 |
| 21.11.2017 05:00 - 06:00 | 0 | 0 | 0 | 0 |
| 21.11.2017 06:00 - 07:00 | 0 | 0 | 0 | 0 |
| 21.11.2017 07:00 - 08:00 | 0 | 0 | 0 | 0 |
| 21.11.2017 08:00 - 09:00 | 0 | 0 | 0 | 0 |
| 21.11.2017 09:00 - 10:00 | 0 | 0 | 0 | 0 |
| 21.11.2017 10:00 - 11:00 | 0 | 0 | 0 | 0 |
| 21.11.2017 11:00 - 12:00 | 0 | 0 | 0 | 0 |
| 21.11.2017 12:00 - 13:00 | 0 | 0 | 0 | 0 |
| 21.11.2017 13:00 - 14:00 | 0 | 0 | 0 | 0 |
| 21.11.2017 14:00 - 15:00 | 0 | 0 | 0 | 0 |
| 21.11.2017 15:00 - 16:00 | 0 | 0 | 0 | 0 |
| 21.11.2017 16:00 - 17:00 | 0 | 0 | 0 | 0 |
| 21.11.2017 17:00 - 18:00 | 0 | 0 | 0 | 0 |
| 21.11.2017 18:00 - 19:00 | 0 | 0 | 0 | 0 |
| 21.11.2017 19:00 - 20:00 | 0 | 0 | 0 | 0 |
| 21.11.2017 20:00 - 21:00 | 0 | 0 | 0 | 0 |
| 21.11.2017 21:00 - 22:00 | 0 | 0 | 0 | 0 |
| 21.11.2017 22:00 - 23:00 | 0 | 0 | 0 | 0 |
| 21.11.2017 23:00 - 24:00 | 0 | 0 | 0 | 0 |
| 22.11.2017 00:00 - 01:00 | 0 | 0 | 0 | 0 |
| 22.11.2017 01:00 - 02:00 | 0 | 0 | 0 | 0 |
| 22.11.2017 02:00 - 03:00 | 0 | 0 | 0 | 0 |
| 22.11.2017 03:00 - 04:00 | 0 | 0 | 0 | 0 |
| 22.11.2017 04:00 - 05:00 | 0 | 0 | 0 | 0 |
| 22.11.2017 05:00 - 06:00 | 0 | 0 | 0 | 0 |
| 22.11.2017 06:00 - 07:00 | 0 | 0 | 0 | 0 |
| 22.11.2017 07:00 - 08:00 | 0 | 0 | 0 | 0 |
| 22.11.2017 08:00 - 09:00 | 0 | 0 | 0 | 0 |
| 22.11.2017 09:00 - 10:00 | 0 | 0 | 0 | 0 |
| 22.11.2017 10:00 - 11:00 | 0 | 0 | 0 | 0 |
| 22.11.2017 11:00 - 12:00 | 0 | 0 | 0 | 0 |
| 22.11.2017 12:00 - 13:00 | 0 | 0 | 0 | 0 |
| 22.11.2017 13:00 - 14:00 | 0 | 0 | 0 | 0 |
| 22.11.2017 14:00 - 15:00 | 0 | 0 | 0 | 0 |
| 22.11.2017 15:00 - 16:00 | 0 | 0 | 0 | 0 |
| 22.11.2017 16:00 - 17:00 | 0 | 0 | 0 | 0 |
| 22.11.2017 17:00 - 18:00 | 0 | 0 | 0 | 0 |
| 22.11.2017 18:00 - 19:00 | 0 | 0 | 0 | 0 |
| 22.11.2017 19:00 - 20:00 | 0 | 0 | 0 | 0 |
| 22.11.2017 20:00 - 21:00 | 0 | 0 | 0 | 0 |
| 22.11.2017 21:00 - 22:00 | 0 | 0 | 0 | 0 |
| 22.11.2017 22:00 - 23:00 | 0 | 0 | 0 | 0 |
| 22.11.2017 23:00 - 24:00 | 0 | 0 | 0 | 0 |
| 23.11.2017 00:00 - 01:00 | 0 | -300 | 0 | 0 |
| 23.11.2017 01:00 - 02:00 | 0 | -300 | 0 | 0 |
| 23.11.2017 02:00 - 03:00 | 0 | -300 | 0 | 0 |
| 23.11.2017 03:00 - 04:00 | 0 | -300 | 0 | 0 |
| 23.11.2017 04:00 - 05:00 | 0 | -300 | 0 | 0 |
| 23.11.2017 05:00 - 06:00 | 0 | -300 | 0 | 0 |
| 23.11.2017 06:00 - 07:00 | 0 | 0 | 0 | 0 |
| 23.11.2017 07:00 - 08:00 | 0 | 0 | 0 | 0 |
| 23.11.2017 08:00 - 09:00 | 0 | 0 | 0 | 0 |
| 23.11.2017 09:00 - 10:00 | 0 | 0 | 0 | 0 |
| 23.11.2017 10:00 - 11:00 | 0 | 0 | 0 | 0 |
| 23.11.2017 11:00 - 12:00 | 0 | 0 | 0 | 0 |
| 23.11.2017 12:00 - 13:00 | 0 | 0 | 0 | 0 |
| 23.11.2017 13:00 - 14:00 | 0 | 0 | 0 | 0 |
| 23.11.2017 14:00 - 15:00 | 0 | 0 | 0 | 0 |
| 23.11.2017 15:00 - 16:00 | 0 | 0 | 0 | 0 |
| 23.11.2017 16:00 - 17:00 | 0 | 0 | 0 | 0 |
| 23.11.2017 17:00 - 18:00 | 0 | 0 | 0 | 0 |
| 23.11.2017 18:00 - 19:00 | 0 | 0 | 0 | 0 |
| 23.11.2017 19:00 - 20:00 | 0 | 0 | 0 | 0 |
| 23.11.2017 20:00 - 21:00 | 0 | 0 | 0 | 0 |
| 23.11.2017 21:00 - 22:00 | 0 | 0 | 0 | 0 |
| 23.11.2017 22:00 - 23:00 | 0 | 0 | 0 | 0 |
| 23.11.2017 23:00 - 24:00 | 0 | 0 | 0 | 0 |
| 24.11.2017 00:00 - 01:00 | 0 | 0 | 0 | 0 |
| 24.11.2017 01:00 - 02:00 | 0 | 0 | 0 | 0 |
| 24.11.2017 02:00 - 03:00 | 530 | 0 | 0 | 0 |
| 24.11.2017 03:00 - 04:00 | 559 | 0 | 0 | 0 |
| 24.11.2017 04:00 - 05:00 | 1059 | 0 | 0 | 0 |
| 24.11.2017 05:00 - 06:00 | 1059 | 0 | 0 | 0 |
| 24.11.2017 06:00 - 07:00 | 0 | 0 | 0 | 0 |
| 24.11.2017 07:00 - 08:00 | 0 | 0 | 0 | 0 |
| 24.11.2017 08:00 - 09:00 | 0 | 0 | 0 | 0 |
| 24.11.2017 09:00 - 10:00 | 0 | 0 | 0 | 0 |
| 24.11.2017 10:00 - 11:00 | 0 | 0 | 0 | 0 |
| 24.11.2017 11:00 - 12:00 | 0 | 0 | 0 | 0 |
| 24.11.2017 12:00 - 13:00 | 0 | 0 | 0 | 0 |
| 24.11.2017 13:00 - 14:00 | 0 | 0 | 0 | 0 |
| 24.11.2017 14:00 - 15:00 | 0 | 0 | 0 | 0 |
| 24.11.2017 15:00 - 16:00 | 0 | 0 | 0 | 0 |
| 24.11.2017 16:00 - 17:00 | 0 | 0 | 0 | 0 |
| 24.11.2017 17:00 - 18:00 | 0 | 0 | 0 | 0 |
| 24.11.2017 18:00 - 19:00 | 0 | 0 | 0 | 0 |
| 24.11.2017 19:00 - 20:00 | 0 | 0 | 0 | 0 |
| 24.11.2017 20:00 - 21:00 | 0 | 0 | 0 | 0 |
| 24.11.2017 21:00 - 22:00 | 0 | 0 | 0 | 0 |
| 24.11.2017 22:00 - 23:00 | 0 | 0 | 0 | 0 |
| 24.11.2017 23:00 - 24:00 | 0 | 0 | 0 | 0 |
| 25.11.2017 00:00 - 01:00 | 0 | 0 | 0 | 0 |
| 25.11.2017 01:00 - 02:00 | 0 | 0 | 0 | 0 |
| 25.11.2017 02:00 - 03:00 | 300 | 0 | 0 | 0 |
| 25.11.2017 03:00 - 04:00 | 300 | 0 | 0 | 0 |
| 25.11.2017 04:00 - 05:00 | 300 | 0 | 0 | 0 |
| 25.11.2017 05:00 - 06:00 | 300 | 0 | 0 | 0 |
| 25.11.2017 06:00 - 07:00 | 0 | 0 | 0 | 0 |
| 25.11.2017 07:00 - 08:00 | 0 | 0 | 0 | 0 |
| 25.11.2017 08:00 - 09:00 | 0 | 0 | 0 | 0 |
| 25.11.2017 09:00 - 10:00 | 0 | 0 | 0 | 0 |
| 25.11.2017 10:00 - 11:00 | 0 | 0 | 0 | 0 |
| 25.11.2017 11:00 - 12:00 | 0 | 0 | 0 | 0 |
| 25.11.2017 12:00 - 13:00 | 0 | 0 | 0 | 0 |
| 25.11.2017 13:00 - 14:00 | 0 | 0 | 0 | 0 |
| 25.11.2017 14:00 - 15:00 | 0 | 0 | 0 | 0 |
| 25.11.2017 15:00 - 16:00 | 0 | 0 | 0 | 0 |
| 25.11.2017 16:00 - 17:00 | 0 | 0 | 0 | 0 |
| 25.11.2017 17:00 - 18:00 | 0 | 0 | 0 | 0 |
| 25.11.2017 18:00 - 19:00 | 0 | 0 | 0 | 0 |
| 25.11.2017 19:00 - 20:00 | 0 | 0 | 0 | 0 |
| 25.11.2017 20:00 - 21:00 | 0 | 0 | 0 | 0 |
| 25.11.2017 21:00 - 22:00 | 0 | 0 | 0 | 0 |
| 25.11.2017 22:00 - 23:00 | 0 | 0 | 0 | 0 |
| 25.11.2017 23:00 - 24:00 | 0 | 0 | 0 | 0 |
| 26.11.2017 00:00 - 01:00 | 0 | 0 | 0 | 0 |
| 26.11.2017 01:00 - 02:00 | 0 | 0 | 0 | 0 |
| 26.11.2017 02:00 - 03:00 | 0 | 0 | 0 | 0 |
| 26.11.2017 03:00 - 04:00 | 0 | 0 | 0 | 0 |
| 26.11.2017 04:00 - 05:00 | 0 | 0 | 0 | 0 |
| 26.11.2017 05:00 - 06:00 | 0 | 0 | 0 | 0 |
| 26.11.2017 06:00 - 07:00 | 0 | 0 | 0 | 0 |
| 26.11.2017 07:00 - 08:00 | 0 | 0 | 0 | 0 |
| 26.11.2017 08:00 - 09:00 | 0 | 0 | 0 | 0 |
| 26.11.2017 09:00 - 10:00 | 0 | 0 | 0 | 0 |
| 26.11.2017 10:00 - 11:00 | 0 | 0 | 0 | 0 |
| 26.11.2017 11:00 - 12:00 | 0 | 0 | 0 | 0 |
| 26.11.2017 12:00 - 13:00 | 0 | 0 | 0 | 0 |
| 26.11.2017 13:00 - 14:00 | 0 | 0 | 0 | 0 |
| 26.11.2017 14:00 - 15:00 | 0 | 0 | 0 | 0 |
| 26.11.2017 15:00 - 16:00 | 0 | 0 | 0 | 0 |
| 26.11.2017 16:00 - 17:00 | 0 | 0 | 0 | 0 |
| 26.11.2017 17:00 - 18:00 | 0 | 0 | 0 | 0 |
| 26.11.2017 18:00 - 19:00 | 0 | 0 | 0 | 0 |
| 26.11.2017 19:00 - 20:00 | 0 | 0 | 0 | 0 |
| 26.11.2017 20:00 - 21:00 | 0 | 0 | 0 | 0 |
| 26.11.2017 21:00 - 22:00 | 0 | 0 | 0 | 0 |
| 26.11.2017 22:00 - 23:00 | 0 | 0 | 0 | 0 |
| 26.11.2017 23:00 - 24:00 | 0 | 0 | 0 | 0 |
| 27.11.2017 00:00 - 01:00 | 0 | 0 | 0 | 0 |
| 27.11.2017 01:00 - 02:00 | 0 | 0 | 0 | 0 |
| 27.11.2017 02:00 - 03:00 | 0 | 0 | 0 | 0 |
| 27.11.2017 03:00 - 04:00 | 0 | 0 | 0 | 0 |
| 27.11.2017 04:00 - 05:00 | 0 | 0 | 0 | 0 |
| 27.11.2017 05:00 - 06:00 | 0 | 0 | 0 | 0 |
| 27.11.2017 06:00 - 07:00 | 0 | 0 | 0 | 0 |
| 27.11.2017 07:00 - 08:00 | 0 | 0 | 0 | 0 |
| 27.11.2017 08:00 - 09:00 | 0 | 0 | 0 | 0 |
| 27.11.2017 09:00 - 10:00 | 0 | 0 | 0 | 0 |
| 27.11.2017 10:00 - 11:00 | 0 | 0 | 0 | 0 |
| 27.11.2017 11:00 - 12:00 | 0 | 0 | 0 | 0 |
| 27.11.2017 12:00 - 13:00 | 500 | 0 | 0 | 0 |
| 27.11.2017 13:00 - 14:00 | 500 | 0 | 0 | 0 |
| 27.11.2017 14:00 - 15:00 | 500 | 0 | 0 | 0 |
| 27.11.2017 15:00 - 16:00 | 500 | 0 | 0 | 0 |
| 27.11.2017 16:00 - 17:00 | 500 | 0 | 0 | 0 |
| 27.11.2017 17:00 - 18:00 | 500 | 0 | 0 | 0 |
| 27.11.2017 18:00 - 19:00 | 500 | 0 | 0 | 0 |
| 27.11.2017 19:00 - 20:00 | 500 | 0 | 0 | 0 |
| 27.11.2017 20:00 - 21:00 | 500 | 0 | 0 | 0 |
| 27.11.2017 21:00 - 22:00 | 500 | 0 | 0 | 0 |
| 27.11.2017 22:00 - 23:00 | 500 | 0 | 0 | 0 |
| 27.11.2017 23:00 - 24:00 | 500 | 0 | 0 | 0 |
| 28.11.2017 00:00 - 01:00 | 500 | 0 | 0 | 0 |
| 28.11.2017 01:00 - 02:00 | 500 | 0 | 0 | 0 |
| 28.11.2017 02:00 - 03:00 | 500 | 0 | 0 | 0 |
| 28.11.2017 03:00 - 04:00 | 500 | 0 | 0 | 0 |
| 28.11.2017 04:00 - 05:00 | 500 | 0 | 0 | 0 |
| 28.11.2017 05:00 - 06:00 | 500 | 0 | 0 | 0 |
| 28.11.2017 06:00 - 07:00 | 0 | 0 | 0 | 0 |
| 28.11.2017 07:00 - 08:00 | 0 | 0 | 0 | 0 |
| 28.11.2017 08:00 - 09:00 | 0 | 0 | 0 | 0 |
| 28.11.2017 09:00 - 10:00 | 0 | 0 | 0 | 0 |
| 28.11.2017 10:00 - 11:00 | 0 | 0 | 0 | 0 |
| 28.11.2017 11:00 - 12:00 | 0 | 0 | 0 | 0 |
| 28.11.2017 12:00 - 13:00 | 0 | 0 | 0 | 0 |
| 28.11.2017 13:00 - 14:00 | 0 | 0 | 0 | 0 |
| 28.11.2017 14:00 - 15:00 | 0 | 0 | 0 | 0 |
| 28.11.2017 15:00 - 16:00 | 0 | 0 | 0 | 0 |
| 28.11.2017 16:00 - 17:00 | 0 | 0 | 0 | 0 |
| 28.11.2017 17:00 - 18:00 | 0 | 0 | 0 | 0 |
| 28.11.2017 18:00 - 19:00 | 0 | 0 | 0 | 0 |
| 28.11.2017 19:00 - 20:00 | 0 | 0 | 0 | 0 |
| 28.11.2017 20:00 - 21:00 | 0 | 0 | 0 | 0 |
| 28.11.2017 21:00 - 22:00 | 0 | 0 | 0 | 0 |
| 28.11.2017 22:00 - 23:00 | 0 | 0 | 0 | 0 |
| 28.11.2017 23:00 - 24:00 | 0 | 0 | 0 | 0 |
| 29.11.2017 00:00 - 01:00 | 0 | 0 | 0 | 0 |
| 29.11.2017 01:00 - 02:00 | 0 | 0 | 0 | 0 |
| 29.11.2017 02:00 - 03:00 | 210 | 0 | 0 | 0 |
| 29.11.2017 03:00 - 04:00 | 710 | 0 | 0 | 0 |
| 29.11.2017 04:00 - 05:00 | 710 | 0 | 0 | 0 |
| 29.11.2017 05:00 - 06:00 | 710 | 0 | 0 | 0 |
| 29.11.2017 06:00 - 07:00 | 0 | 0 | 0 | 0 |
| 29.11.2017 07:00 - 08:00 | 0 | 0 | 0 | 0 |
| 29.11.2017 08:00 - 09:00 | 0 | 0 | 0 | 0 |
| 29.11.2017 09:00 - 10:00 | 0 | 0 | 0 | 0 |
| 29.11.2017 10:00 - 11:00 | 0 | 0 | 0 | 0 |
| 29.11.2017 11:00 - 12:00 | 0 | 0 | 0 | 0 |
| 29.11.2017 12:00 - 13:00 | 0 | 0 | 0 | 0 |
| 29.11.2017 13:00 - 14:00 | 0 | 0 | 0 | 0 |
| 29.11.2017 14:00 - 15:00 | 0 | 0 | 0 | 0 |
| 29.11.2017 15:00 - 16:00 | 0 | 0 | 0 | 0 |
| 29.11.2017 16:00 - 17:00 | 0 | 0 | 0 | 0 |
| 29.11.2017 17:00 - 18:00 | 0 | 0 | 0 | 0 |
| 29.11.2017 18:00 - 19:00 | 0 | 0 | 0 | 0 |
| 29.11.2017 19:00 - 20:00 | 0 | 0 | 0 | 0 |
| 29.11.2017 20:00 - 21:00 | 0 | 0 | 0 | 0 |
| 29.11.2017 21:00 - 22:00 | 0 | 0 | 0 | 0 |
| 29.11.2017 22:00 - 23:00 | 0 | 0 | 0 | 0 |
| 29.11.2017 23:00 - 24:00 | 0 | 0 | 0 | 0 |
| 30.11.2017 00:00 - 01:00 | 0 | 0 | 0 | 0 |
| 30.11.2017 01:00 - 02:00 | 0 | 0 | 0 | 0 |
| 30.11.2017 02:00 - 03:00 | 0 | 0 | 0 | 0 |
| 30.11.2017 03:00 - 04:00 | 0 | -500 | 0 | 0 |
| 30.11.2017 04:00 - 05:00 | 0 | -500 | 0 | 0 |
| 30.11.2017 05:00 - 06:00 | 0 | -500 | 0 | 0 |
| 30.11.2017 06:00 - 07:00 | 0 | 0 | 0 | 0 |
| 30.11.2017 07:00 - 08:00 | 0 | 0 | 0 | 0 |
| 30.11.2017 08:00 - 09:00 | 0 | 0 | 0 | 0 |
| 30.11.2017 09:00 - 10:00 | 0 | 0 | 0 | 0 |
| 30.11.2017 10:00 - 11:00 | 0 | 0 | 0 | 0 |
| 30.11.2017 11:00 - 12:00 | 0 | 0 | 0 | 0 |
| 30.11.2017 12:00 - 13:00 | 0 | 0 | 0 | 0 |
| 30.11.2017 13:00 - 14:00 | 0 | 0 | 0 | 0 |
| 30.11.2017 14:00 - 15:00 | 0 | 0 | 0 | 0 |
| 30.11.2017 15:00 - 16:00 | 0 | 0 | 0 | 0 |
| 30.11.2017 16:00 - 17:00 | 0 | 0 | 0 | 0 |
| 30.11.2017 17:00 - 18:00 | 0 | 0 | 0 | 0 |
| 30.11.2017 18:00 - 19:00 | 0 | 0 | 0 | 0 |
| 30.11.2017 19:00 - 20:00 | 0 | 0 | 0 | 0 |
| 30.11.2017 20:00 - 21:00 | 0 | 0 | 0 | 0 |
| 30.11.2017 21:00 - 22:00 | 0 | 0 | 0 | 0 |
| 30.11.2017 22:00 - 23:00 | 0 | 0 | 0 | 0 |
| 30.11.2017 23:00 - 24:00 | 0 | 0 | 0 | 0 |
| 01.12.2017 00:00 - 01:00 | 0 | 0 | 0 | 0 |
| 01.12.2017 01:00 - 02:00 | 0 | 0 | 0 | 0 |
| 01.12.2017 02:00 - 03:00 | 0 | 0 | 0 | 0 |
| 01.12.2017 03:00 - 04:00 | 0 | 0 | 0 | 0 |
| 01.12.2017 04:00 - 05:00 | 0 | 0 | 0 | 0 |
| 01.12.2017 05:00 - 06:00 | 0 | 0 | 0 | 0 |